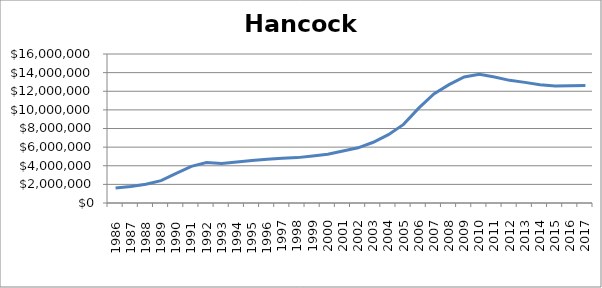
| Category | Hancock |
|---|---|
|       1986 | 1609250 |
|       1987 | 1764150 |
|       1988 | 2005550 |
|       1989 | 2406650 |
|       1990 | 3179600 |
|       1991 | 3937050 |
|       1992 | 4341500 |
|       1993 | 4247250 |
|       1994 | 4411400 |
|       1995 | 4569750 |
|       1996 | 4700950 |
| 1997 | 4818100 |
| 1998 | 4872800 |
| 1999 | 5055400 |
| 2000 | 5243400 |
| 2001 | 5577650 |
| 2002 | 5926650 |
| 2003 | 6520750 |
| 2004 | 7340800 |
| 2005 | 8443550 |
| 2006 | 10183900 |
| 2007 | 11721500 |
| 2008 | 12705150 |
| 2009 | 13533050 |
| 2010 | 13812550 |
| 2011 | 13533550 |
| 2012 | 13170950 |
| 2013 | 12951950 |
| 2014 | 12692700 |
| 2015 | 12570400 |
| 2016 | 12603950 |
| 2017 | 12613650 |